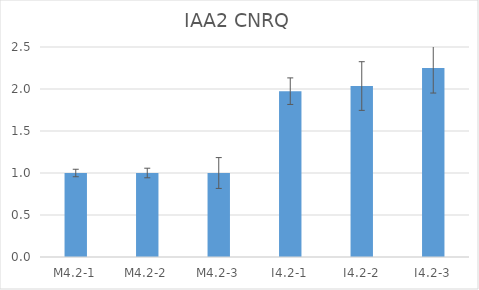
| Category | IAA2 CNRQ |
|---|---|
| M4.2-1 | 1 |
| M4.2-2 | 1 |
| M4.2-3 | 1 |
| I4.2-1 | 1.974 |
| I4.2-2 | 2.035 |
| I4.2-3 | 2.251 |